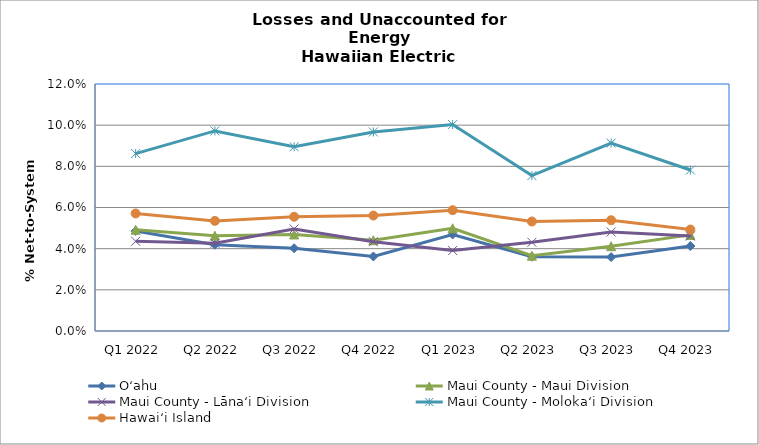
| Category | Series 1 | O‘ahu | Maui County - Maui Division | Maui County - Lānaʻi Division | Maui County - Moloka‘i Division | Hawai‘i Island |
|---|---|---|---|---|---|---|
| Q1 2022 |  | 0.049 | 0.049 | 0.044 | 0.086 | 0.057 |
| Q2 2022 |  | 0.042 | 0.046 | 0.043 | 0.097 | 0.053 |
| Q3 2022 |  | 0.04 | 0.047 | 0.05 | 0.089 | 0.056 |
| Q4 2022 |  | 0.036 | 0.044 | 0.043 | 0.097 | 0.056 |
| Q1 2023 |  | 0.047 | 0.05 | 0.039 | 0.1 | 0.059 |
| Q2 2023 |  | 0.036 | 0.037 | 0.043 | 0.075 | 0.053 |
| Q3 2023 |  | 0.036 | 0.041 | 0.048 | 0.091 | 0.054 |
| Q4 2023 |  | 0.041 | 0.047 | 0.046 | 0.078 | 0.049 |